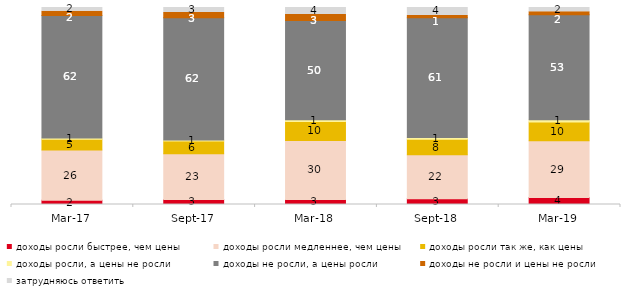
| Category | доходы росли быстрее, чем цены | доходы росли медленнее, чем цены | доходы росли так же, как цены | доходы росли, а цены не росли | доходы не росли, а цены росли | доходы не росли и цены не росли | затрудняюсь ответить |
|---|---|---|---|---|---|---|---|
| 2017-03-01 | 2.1 | 25.6 | 5.45 | 0.65 | 62.1 | 2.2 | 1.9 |
| 2017-09-01 | 2.55 | 23.2 | 6.45 | 0.5 | 62.1 | 2.7 | 2.5 |
| 2018-03-01 | 2.6 | 29.9 | 9.65 | 0.9 | 50.4 | 3 | 3.55 |
| 2018-09-01 | 2.9 | 22.3 | 7.95 | 0.9 | 60.8 | 1.15 | 4 |
| 2019-03-01 | 3.58 | 28.792 | 9.547 | 1.044 | 53.357 | 1.542 | 2.138 |